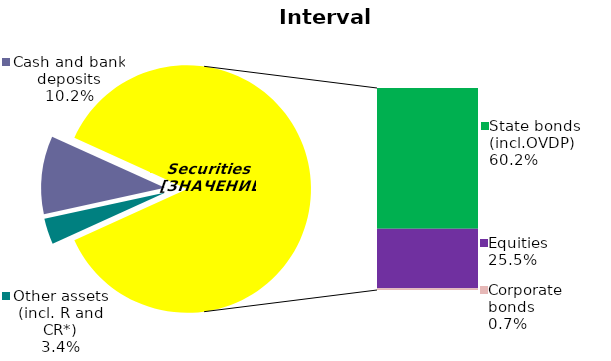
| Category | Series 0 |
|---|---|
| Other assets (incl. R and CR*) | 0.034 |
| Cash and bank deposits | 0.102 |
| Bank metals | 0 |
| State bonds (incl.OVDP) | 0.602 |
| Municipal bonds | 0 |
| Equities | 0.255 |
| Corporate bonds | 0.007 |